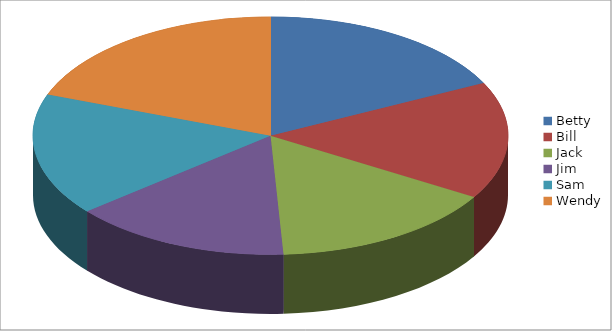
| Category | Series 0 |
|---|---|
| Betty | 234000 |
| Bill | 211000 |
| Jack | 205000 |
| Jim | 197000 |
| Sam | 220000 |
| Wendy | 256000 |